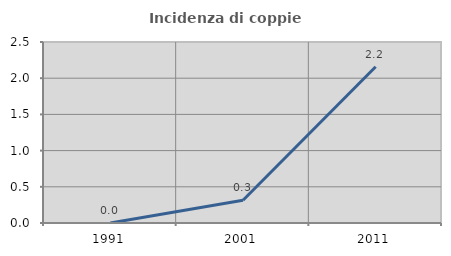
| Category | Incidenza di coppie miste |
|---|---|
| 1991.0 | 0 |
| 2001.0 | 0.314 |
| 2011.0 | 2.158 |